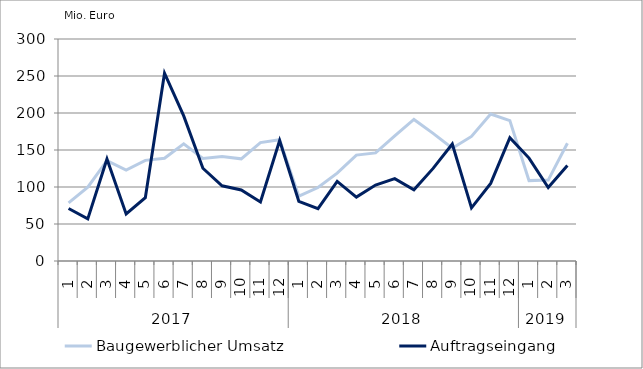
| Category | Baugewerblicher Umsatz | Auftragseingang |
|---|---|---|
| 0 | 78446.78 | 70908.903 |
| 1 | 99841.908 | 56868.408 |
| 2 | 135679.867 | 137790.423 |
| 3 | 123004.403 | 63637.761 |
| 4 | 136010.071 | 85644.63 |
| 5 | 138859.308 | 253791.552 |
| 6 | 158353.879 | 196034.198 |
| 7 | 138510.315 | 125319.873 |
| 8 | 141109.925 | 101690.626 |
| 9 | 138067.098 | 95966.626 |
| 10 | 160064.454 | 79701.993 |
| 11 | 163969.017 | 162878.607 |
| 12 | 87640.529 | 80684.627 |
| 13 | 99259.455 | 70746.763 |
| 14 | 118764.324 | 107538.747 |
| 15 | 143144.178 | 86374.619 |
| 16 | 146070.782 | 102661.329 |
| 17 | 169150.753 | 111287.709 |
| 18 | 191277.885 | 96286.662 |
| 19 | 172425.535 | 125142.495 |
| 20 | 152354.98 | 158112.302 |
| 21 | 168372.756 | 71808.619 |
| 22 | 198558.472 | 104904.147 |
| 23 | 189665.914 | 166653.461 |
| 24 | 108616.605 | 139065.287 |
| 25 | 109331.58 | 99318.609 |
| 26 | 159117.81 | 129002.041 |